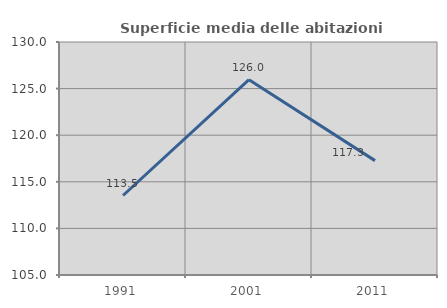
| Category | Superficie media delle abitazioni occupate |
|---|---|
| 1991.0 | 113.529 |
| 2001.0 | 125.956 |
| 2011.0 | 117.273 |